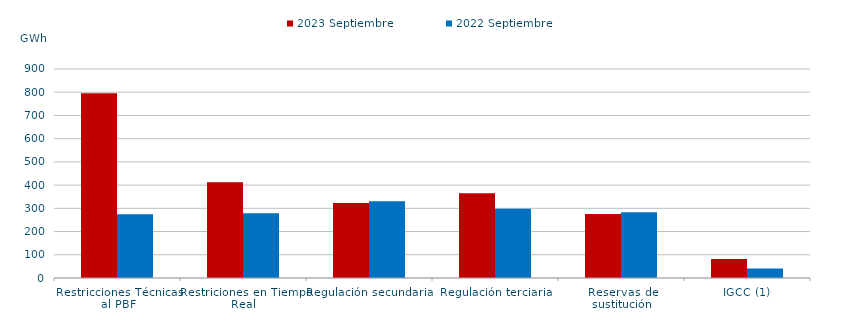
| Category | 2023 Septiembre | 2022 Septiembre |
|---|---|---|
| Restricciones Técnicas al PBF | 795.117 | 274.39 |
| Restriciones en Tiempo Real | 412.775 | 278.853 |
| Regulación secundaria | 323.276 | 330.731 |
| Regulación terciaria | 364.772 | 297.869 |
| Reservas de sustitución | 275.456 | 283.395 |
| IGCC (1) | 81.479 | 41.337 |